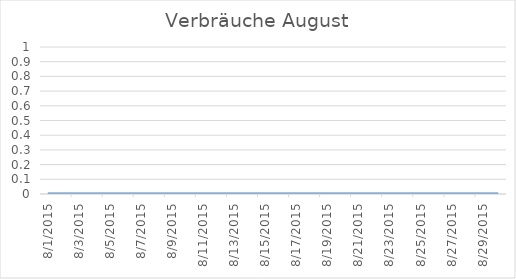
| Category | Series 0 |
|---|---|
| 01/08/2015 | 0 |
| 02/08/2015 | 0 |
| 03/08/2015 | 0 |
| 04/08/2015 | 0 |
| 05/08/2015 | 0 |
| 06/08/2015 | 0 |
| 07/08/2015 | 0 |
| 08/08/2015 | 0 |
| 09/08/2015 | 0 |
| 10/08/2015 | 0 |
| 11/08/2015 | 0 |
| 12/08/2015 | 0 |
| 13/08/2015 | 0 |
| 14/08/2015 | 0 |
| 15/08/2015 | 0 |
| 16/08/2015 | 0 |
| 17/08/2015 | 0 |
| 18/08/2015 | 0 |
| 19/08/2015 | 0 |
| 20/08/2015 | 0 |
| 21/08/2015 | 0 |
| 22/08/2015 | 0 |
| 23/08/2015 | 0 |
| 24/08/2015 | 0 |
| 25/08/2015 | 0 |
| 26/08/2015 | 0 |
| 27/08/2015 | 0 |
| 28/08/2015 | 0 |
| 29/08/2015 | 0 |
| 30/08/2015 | 0 |